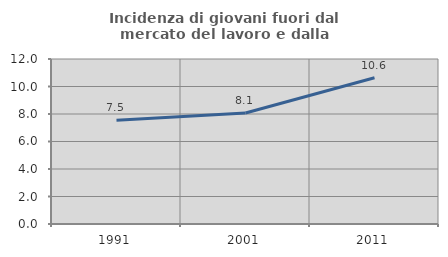
| Category | Incidenza di giovani fuori dal mercato del lavoro e dalla formazione  |
|---|---|
| 1991.0 | 7.538 |
| 2001.0 | 8.075 |
| 2011.0 | 10.637 |